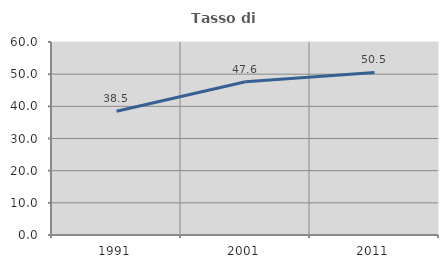
| Category | Tasso di occupazione   |
|---|---|
| 1991.0 | 38.462 |
| 2001.0 | 47.619 |
| 2011.0 | 50.532 |